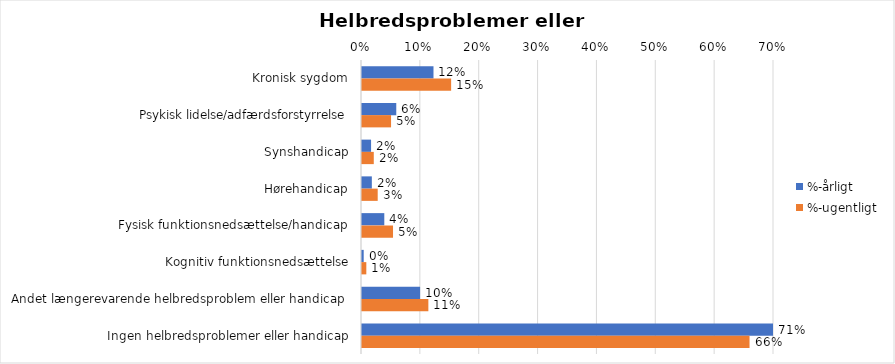
| Category | %-årligt | %-ugentligt |
|---|---|---|
| Kronisk sygdom | 0.121 | 0.151 |
| Psykisk lidelse/adfærdsforstyrrelse | 0.058 | 0.049 |
| Synshandicap | 0.015 | 0.02 |
| Hørehandicap | 0.017 | 0.027 |
| Fysisk funktionsnedsættelse/handicap | 0.038 | 0.053 |
| Kognitiv funktionsnedsættelse | 0.003 | 0.007 |
| Andet længerevarende helbredsproblem eller handicap  | 0.099 | 0.113 |
| Ingen helbredsproblemer eller handicap | 0.707 | 0.658 |